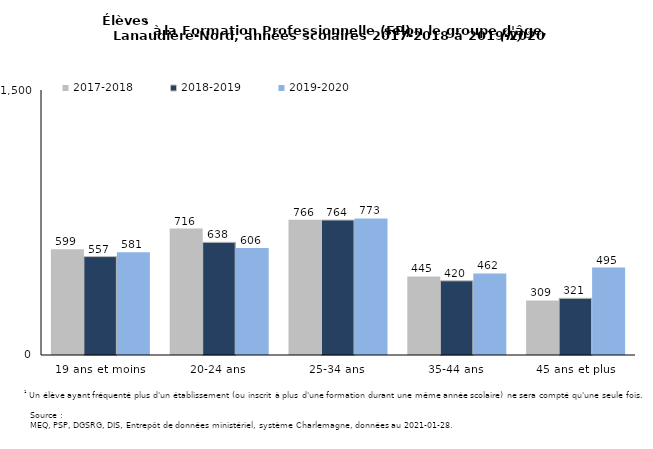
| Category | 2017-2018 | 2018-2019 | 2019-2020 |
|---|---|---|---|
| 19 ans et moins | 599 | 557 | 581 |
| 20-24 ans | 716 | 638 | 606 |
| 25-34 ans | 766 | 764 | 773 |
| 35-44 ans | 445 | 420 | 462 |
| 45 ans et plus | 309 | 321 | 495 |